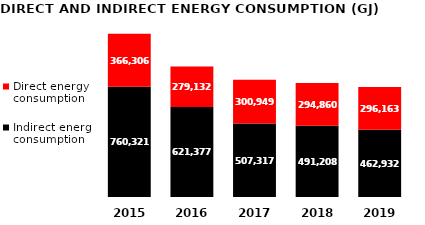
| Category | Indirect energy consumption | Direct energy consumption |
|---|---|---|
| 2019.0 | 462932.44 | 296163.28 |
| 2018.0 | 491208 | 294860 |
| 2017.0 | 507317 | 300949 |
| 2016.0 | 621377 | 279132 |
| 2015.0 | 760321 | 366306 |